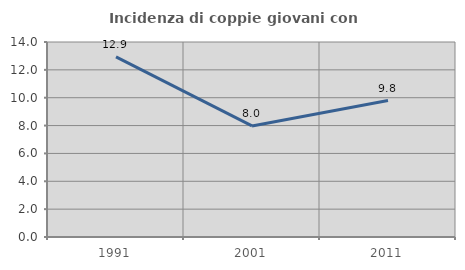
| Category | Incidenza di coppie giovani con figli |
|---|---|
| 1991.0 | 12.931 |
| 2001.0 | 7.972 |
| 2011.0 | 9.793 |